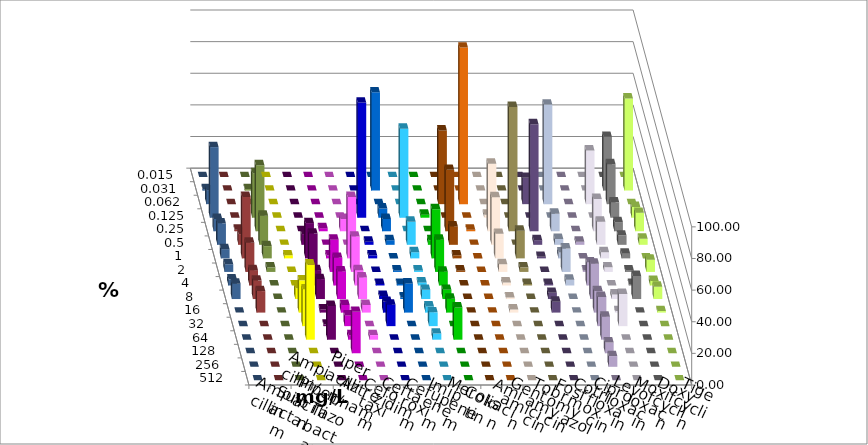
| Category | Ampicillin | Ampicillin/ Sulbactam | Piperacillin | Piperacillin/ Tazobactam | Aztreonam | Cefotaxim | Ceftazidim | Cefuroxim | Imipenem | Meropenem | Colistin | Amikacin | Gentamicin | Tobramycin | Fosfomycin | Cotrimoxazol | Ciprofloxacin | Levofloxacin | Moxifloxacin | Doxycyclin | Tigecyclin |
|---|---|---|---|---|---|---|---|---|---|---|---|---|---|---|---|---|---|---|---|---|---|
| 0.015 | 0 | 0 | 0 | 0 | 0 | 0 | 0 | 0 | 0 | 0 | 0 | 0 | 0 | 0 | 0 | 0 | 0 | 0 | 0 | 0 | 0 |
| 0.031 | 0 | 0 | 0 | 0 | 0 | 62.136 | 0 | 0 | 0 | 0 | 0 | 0 | 0 | 0 | 0 | 0 | 33.981 | 58.252 | 0.971 | 0 | 0.971 |
| 0.062 | 0 | 0 | 0 | 0 | 0 | 0 | 0 | 0 | 46.602 | 99.029 | 0 | 0 | 16.667 | 62.963 | 0 | 33.981 | 25.243 | 0 | 8.738 | 0 | 0 |
| 0.125 | 0 | 0 | 0 | 0 | 72.816 | 5.825 | 56.311 | 1.942 | 0 | 0 | 1.942 | 0 | 0 | 0 | 0 | 0 | 9.709 | 6.796 | 44.66 | 0 | 28.155 |
| 0.25 | 0 | 0 | 1.942 | 7.767 | 0 | 7.767 | 0 | 0 | 38.835 | 0.971 | 42.718 | 78.641 | 67.647 | 11.111 | 0 | 20.388 | 5.825 | 11.65 | 7.767 | 0.971 | 41.748 |
| 0.5 | 0 | 6.796 | 0 | 0 | 1.942 | 2.913 | 14.563 | 2.913 | 11.65 | 0 | 30.097 | 0 | 2.941 | 3.704 | 1.942 | 14.563 | 5.825 | 3.883 | 13.592 | 6.796 | 18.447 |
| 1.0 | 1.942 | 22.33 | 1.942 | 38.835 | 1.942 | 0 | 3.883 | 31.068 | 1.942 | 0 | 15.534 | 17.476 | 0.98 | 3.704 | 0 | 3.883 | 2.913 | 0 | 5.825 | 38.835 | 7.767 |
| 2.0 | 0 | 24.272 | 20.388 | 22.33 | 0 | 0.971 | 0.971 | 20.388 | 0.971 | 0 | 4.854 | 2.913 | 0 | 14.815 | 0.971 | 2.913 | 0.971 | 7.767 | 4.854 | 18.447 | 2.913 |
| 4.0 | 0 | 9.709 | 17.476 | 9.709 | 0.971 | 0.971 | 1.942 | 8.738 | 0 | 0 | 1.942 | 0.971 | 0.98 | 3.704 | 14.563 | 0 | 0.971 | 2.913 | 3.883 | 9.709 | 0 |
| 8.0 | 6.796 | 12.621 | 17.476 | 13.592 | 1.942 | 0.971 | 5.825 | 5.825 | 0 | 0 | 0.971 | 0 | 3.922 | 0 | 22.33 | 2.913 | 14.563 | 7.767 | 9.709 | 11.65 | 0 |
| 16.0 | 20.388 | 1.942 | 4.854 | 4.854 | 6.796 | 18.447 | 3.883 | 8.738 | 0 | 0 | 1.942 | 0 | 6.863 | 0 | 13.592 | 0.971 | 0 | 0.971 | 0 | 13.592 | 0 |
| 32.0 | 23.301 | 0.971 | 6.796 | 0 | 13.592 | 0 | 8.738 | 0 | 0 | 0 | 0 | 0 | 0 | 0 | 18.447 | 20.388 | 0 | 0 | 0 | 0 | 0 |
| 64.0 | 47.573 | 21.359 | 2.913 | 2.913 | 0 | 0 | 3.883 | 20.388 | 0 | 0 | 0 | 0 | 0 | 0 | 14.563 | 0 | 0 | 0 | 0 | 0 | 0 |
| 128.0 | 0 | 0 | 26.214 | 0 | 0 | 0 | 0 | 0 | 0 | 0 | 0 | 0 | 0 | 0 | 6.796 | 0 | 0 | 0 | 0 | 0 | 0 |
| 256.0 | 0 | 0 | 0 | 0 | 0 | 0 | 0 | 0 | 0 | 0 | 0 | 0 | 0 | 0 | 6.796 | 0 | 0 | 0 | 0 | 0 | 0 |
| 512.0 | 0 | 0 | 0 | 0 | 0 | 0 | 0 | 0 | 0 | 0 | 0 | 0 | 0 | 0 | 0 | 0 | 0 | 0 | 0 | 0 | 0 |